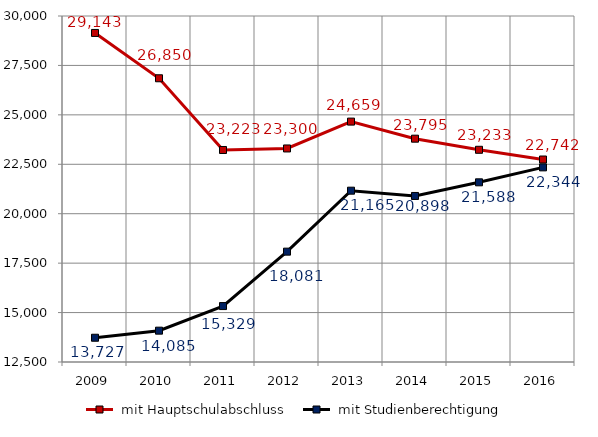
| Category |  mit Hauptschulabschluss |  mit Studienberechtigung |
|---|---|---|
| 2009.0 | 29143 | 13727 |
| 2010.0 | 26850 | 14085 |
| 2011.0 | 23223 | 15329 |
| 2012.0 | 23300 | 18081 |
| 2013.0 | 24659 | 21165 |
| 2014.0 | 23795 | 20898 |
| 2015.0 | 23233 | 21588 |
| 2016.0 | 22742 | 22344 |